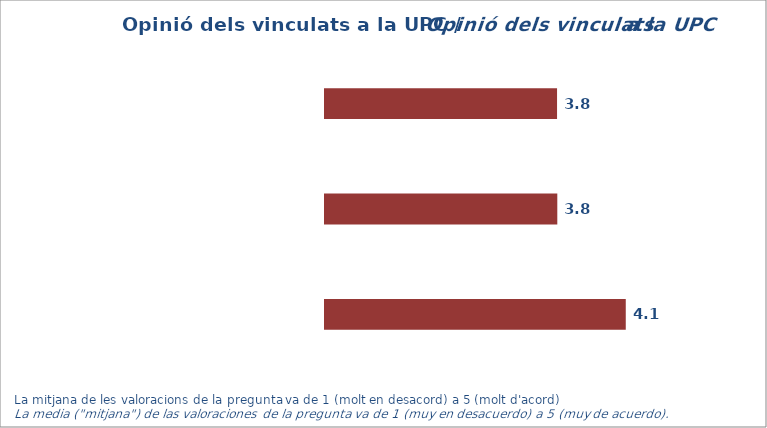
| Category | Mitjana |
|---|---|
| 1.0 | 3.815 |
| 2.0 | 3.816 |
| 3.0 | 4.057 |